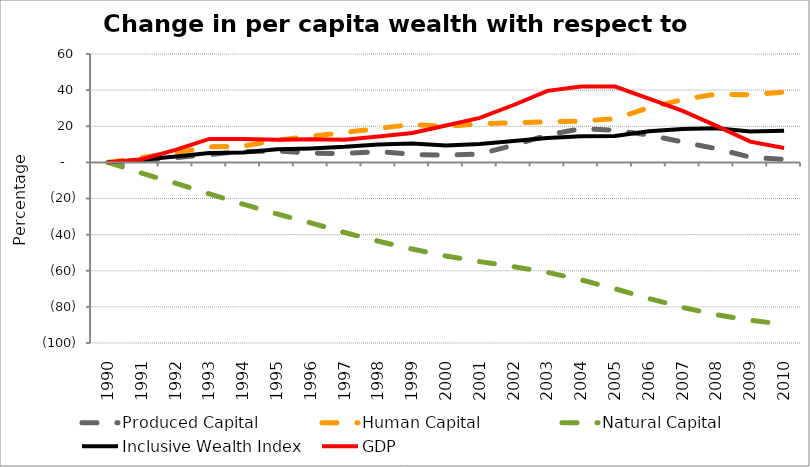
| Category | Produced Capital  | Human Capital | Natural Capital | Inclusive Wealth Index | GDP |
|---|---|---|---|---|---|
| 1990.0 | 0 | 0 | 0 | 0 | 0 |
| 1991.0 | 0.945 | 2.595 | -5.966 | 1.409 | 1.709 |
| 1992.0 | 2.618 | 5.406 | -11.537 | 3.199 | 6.895 |
| 1993.0 | 4.382 | 8.555 | -17.43 | 5.201 | 12.968 |
| 1994.0 | 6.012 | 8.999 | -23.164 | 5.487 | 12.891 |
| 1995.0 | 6.346 | 12.301 | -28.524 | 7.208 | 12.489 |
| 1996.0 | 5.169 | 14.365 | -33.486 | 7.744 | 12.776 |
| 1997.0 | 4.872 | 16.562 | -38.842 | 8.589 | 12.543 |
| 1998.0 | 6.006 | 18.773 | -43.649 | 9.909 | 14.294 |
| 1999.0 | 4.412 | 20.974 | -47.993 | 10.459 | 16.227 |
| 2000.0 | 3.919 | 19.916 | -51.821 | 9.34 | 20.406 |
| 2001.0 | 4.634 | 21.395 | -54.959 | 10.216 | 24.604 |
| 2002.0 | 9.547 | 21.952 | -57.741 | 11.78 | 31.765 |
| 2003.0 | 15.126 | 22.466 | -60.887 | 13.483 | 39.575 |
| 2004.0 | 18.716 | 22.844 | -65.05 | 14.433 | 42.053 |
| 2005.0 | 17.752 | 24.19 | -69.981 | 14.586 | 41.999 |
| 2006.0 | 15.178 | 30.307 | -75.352 | 17.208 | 35.274 |
| 2007.0 | 11.252 | 34.745 | -80.295 | 18.42 | 28.508 |
| 2008.0 | 7.597 | 37.821 | -84.337 | 18.934 | 20.18 |
| 2009.0 | 2.867 | 37.408 | -87.41 | 17.035 | 11.493 |
| 2010.0 | 1.55 | 38.986 | -89.663 | 17.449 | 8.002 |